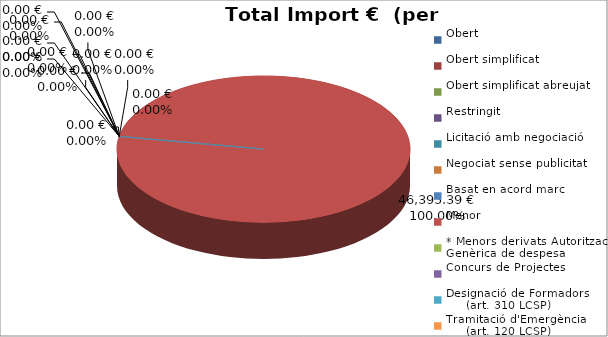
| Category | Total preu
(amb IVA) |
|---|---|
| Obert | 0 |
| Obert simplificat | 0 |
| Obert simplificat abreujat | 0 |
| Restringit | 0 |
| Licitació amb negociació | 0 |
| Negociat sense publicitat | 0 |
| Basat en acord marc | 0 |
| Menor | 46395.39 |
| * Menors derivats Autorització Genèrica de despesa | 0 |
| Concurs de Projectes | 0 |
| Designació de Formadors
     (art. 310 LCSP) | 0 |
| Tramitació d'Emergència
     (art. 120 LCSP) | 0 |